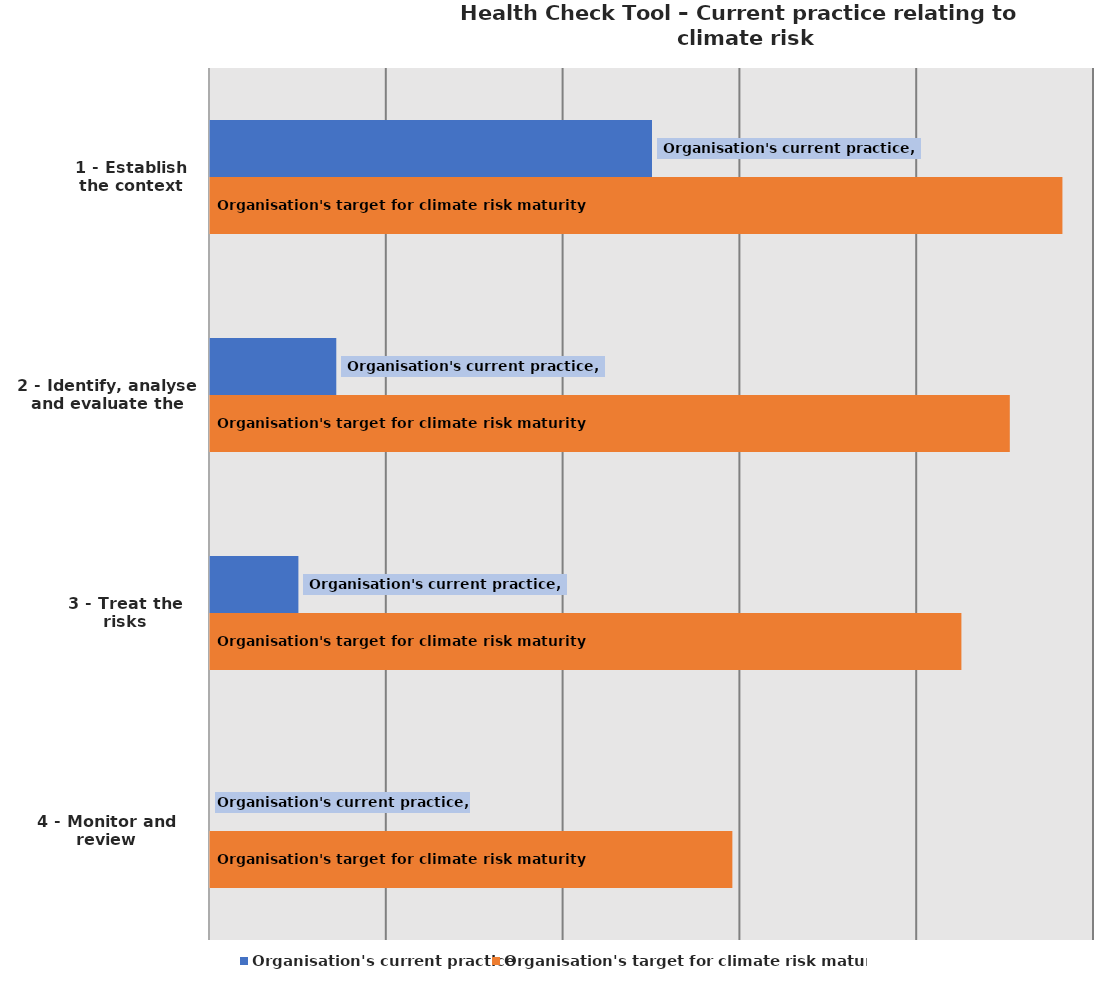
| Category | Organisation's current practice | Organisation's target for climate risk maturity |
|---|---|---|
| 1 - Establish the context | 0.5 | 0.964 |
| 2 - Identify, analyse and evaluate the risks | 0.143 | 0.905 |
| 3 - Treat the risks | 0.1 | 0.85 |
| 4 - Monitor and review | 0 | 0.591 |